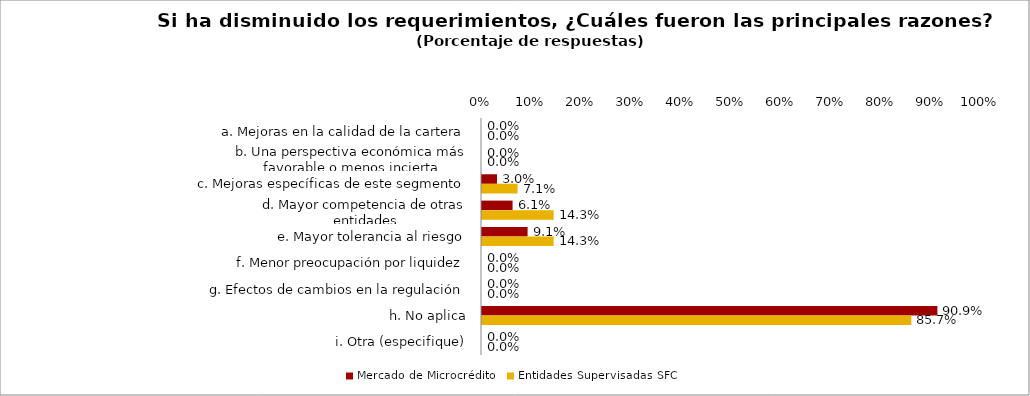
| Category | Mercado de Microcrédito | Entidades Supervisadas SFC |
|---|---|---|
| a. Mejoras en la calidad de la cartera | 0 | 0 |
| b. Una perspectiva económica más favorable o menos incierta | 0 | 0 |
| c. Mejoras específicas de este segmento | 0.03 | 0.071 |
| d. Mayor competencia de otras entidades | 0.061 | 0.143 |
| e. Mayor tolerancia al riesgo | 0.091 | 0.143 |
| f. Menor preocupación por liquidez | 0 | 0 |
| g. Efectos de cambios en la regulación | 0 | 0 |
| h. No aplica | 0.909 | 0.857 |
| i. Otra (especifique) | 0 | 0 |